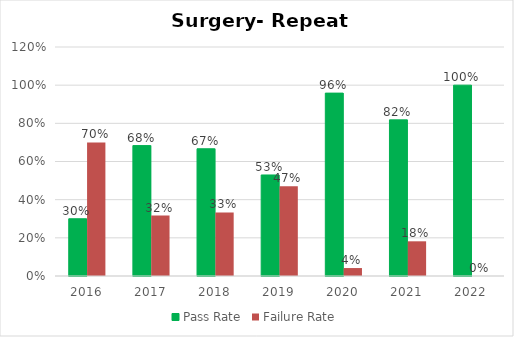
| Category | Pass Rate | Failure Rate |
|---|---|---|
| 2016.0 | 0.3 | 0.7 |
| 2017.0 | 0.683 | 0.317 |
| 2018.0 | 0.667 | 0.333 |
| 2019.0 | 0.529 | 0.471 |
| 2020.0 | 0.958 | 0.042 |
| 2021.0 | 0.818 | 0.182 |
| 2022.0 | 1 | 0 |